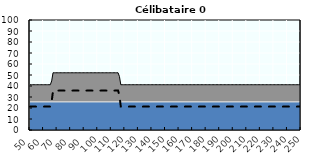
| Category | Coin fiscal marginal (somme des composantes) | Taux d’imposition marginal net |
|---|---|---|
| 50.0 | 41.166 | 21.28 |
| 51.0 | 41.166 | 21.28 |
| 52.0 | 41.166 | 21.28 |
| 53.0 | 41.166 | 21.28 |
| 54.0 | 41.166 | 21.28 |
| 55.0 | 41.166 | 21.28 |
| 56.0 | 41.166 | 21.28 |
| 57.0 | 41.166 | 21.28 |
| 58.0 | 41.166 | 21.28 |
| 59.0 | 41.166 | 21.28 |
| 60.0 | 41.166 | 21.28 |
| 61.0 | 41.166 | 21.28 |
| 62.0 | 41.166 | 21.28 |
| 63.0 | 41.166 | 21.28 |
| 64.0 | 41.166 | 21.28 |
| 65.0 | 41.166 | 21.28 |
| 66.0 | 44.624 | 25.907 |
| 67.0 | 52.028 | 35.813 |
| 68.0 | 52.028 | 35.813 |
| 69.0 | 52.028 | 35.813 |
| 70.0 | 52.028 | 35.813 |
| 71.0 | 52.028 | 35.813 |
| 72.0 | 52.028 | 35.813 |
| 73.0 | 52.028 | 35.813 |
| 74.0 | 52.028 | 35.813 |
| 75.0 | 52.028 | 35.813 |
| 76.0 | 52.028 | 35.813 |
| 77.0 | 52.028 | 35.813 |
| 78.0 | 52.028 | 35.813 |
| 79.0 | 52.028 | 35.813 |
| 80.0 | 52.028 | 35.813 |
| 81.0 | 52.028 | 35.813 |
| 82.0 | 52.028 | 35.813 |
| 83.0 | 52.028 | 35.813 |
| 84.0 | 52.028 | 35.813 |
| 85.0 | 52.028 | 35.813 |
| 86.0 | 52.028 | 35.813 |
| 87.0 | 52.028 | 35.813 |
| 88.0 | 52.028 | 35.813 |
| 89.0 | 52.028 | 35.813 |
| 90.0 | 52.028 | 35.813 |
| 91.0 | 52.028 | 35.813 |
| 92.0 | 52.028 | 35.813 |
| 93.0 | 52.028 | 35.813 |
| 94.0 | 52.028 | 35.813 |
| 95.0 | 52.028 | 35.813 |
| 96.0 | 52.028 | 35.813 |
| 97.0 | 52.028 | 35.813 |
| 98.0 | 52.028 | 35.813 |
| 99.0 | 52.028 | 35.813 |
| 100.0 | 52.028 | 35.813 |
| 101.0 | 52.028 | 35.813 |
| 102.0 | 52.028 | 35.813 |
| 103.0 | 52.028 | 35.813 |
| 104.0 | 52.028 | 35.813 |
| 105.0 | 52.028 | 35.813 |
| 106.0 | 52.028 | 35.813 |
| 107.0 | 52.028 | 35.813 |
| 108.0 | 52.028 | 35.813 |
| 109.0 | 52.028 | 35.813 |
| 110.0 | 52.028 | 35.813 |
| 111.0 | 52.028 | 35.813 |
| 112.0 | 52.028 | 35.813 |
| 113.0 | 52.028 | 35.813 |
| 114.0 | 52.028 | 35.813 |
| 115.0 | 52.028 | 35.813 |
| 116.0 | 48.692 | 31.35 |
| 117.0 | 41.166 | 21.28 |
| 118.0 | 41.166 | 21.28 |
| 119.0 | 41.166 | 21.28 |
| 120.0 | 41.166 | 21.28 |
| 121.0 | 41.166 | 21.28 |
| 122.0 | 41.166 | 21.28 |
| 123.0 | 41.166 | 21.28 |
| 124.0 | 41.166 | 21.28 |
| 125.0 | 41.166 | 21.28 |
| 126.0 | 41.166 | 21.28 |
| 127.0 | 41.166 | 21.28 |
| 128.0 | 41.166 | 21.28 |
| 129.0 | 41.166 | 21.28 |
| 130.0 | 41.166 | 21.28 |
| 131.0 | 41.166 | 21.28 |
| 132.0 | 41.166 | 21.28 |
| 133.0 | 41.166 | 21.28 |
| 134.0 | 41.166 | 21.28 |
| 135.0 | 41.166 | 21.28 |
| 136.0 | 41.166 | 21.28 |
| 137.0 | 41.166 | 21.28 |
| 138.0 | 41.166 | 21.28 |
| 139.0 | 41.166 | 21.28 |
| 140.0 | 41.166 | 21.28 |
| 141.0 | 41.166 | 21.28 |
| 142.0 | 41.166 | 21.28 |
| 143.0 | 41.166 | 21.28 |
| 144.0 | 41.166 | 21.28 |
| 145.0 | 41.166 | 21.28 |
| 146.0 | 41.166 | 21.28 |
| 147.0 | 41.166 | 21.28 |
| 148.0 | 41.166 | 21.28 |
| 149.0 | 41.166 | 21.28 |
| 150.0 | 41.166 | 21.28 |
| 151.0 | 41.166 | 21.28 |
| 152.0 | 41.166 | 21.28 |
| 153.0 | 41.166 | 21.28 |
| 154.0 | 41.166 | 21.28 |
| 155.0 | 41.166 | 21.28 |
| 156.0 | 41.166 | 21.28 |
| 157.0 | 41.166 | 21.28 |
| 158.0 | 41.166 | 21.28 |
| 159.0 | 41.166 | 21.28 |
| 160.0 | 41.166 | 21.28 |
| 161.0 | 41.166 | 21.28 |
| 162.0 | 41.166 | 21.28 |
| 163.0 | 41.166 | 21.28 |
| 164.0 | 41.166 | 21.28 |
| 165.0 | 41.166 | 21.28 |
| 166.0 | 41.166 | 21.28 |
| 167.0 | 41.166 | 21.28 |
| 168.0 | 41.166 | 21.28 |
| 169.0 | 41.166 | 21.28 |
| 170.0 | 41.166 | 21.28 |
| 171.0 | 41.166 | 21.28 |
| 172.0 | 41.166 | 21.28 |
| 173.0 | 41.166 | 21.28 |
| 174.0 | 41.166 | 21.28 |
| 175.0 | 41.166 | 21.28 |
| 176.0 | 41.166 | 21.28 |
| 177.0 | 41.166 | 21.28 |
| 178.0 | 41.166 | 21.28 |
| 179.0 | 41.166 | 21.28 |
| 180.0 | 41.166 | 21.28 |
| 181.0 | 41.166 | 21.28 |
| 182.0 | 41.166 | 21.28 |
| 183.0 | 41.166 | 21.28 |
| 184.0 | 41.166 | 21.28 |
| 185.0 | 41.166 | 21.28 |
| 186.0 | 41.166 | 21.28 |
| 187.0 | 41.166 | 21.28 |
| 188.0 | 41.166 | 21.28 |
| 189.0 | 41.166 | 21.28 |
| 190.0 | 41.166 | 21.28 |
| 191.0 | 41.166 | 21.28 |
| 192.0 | 41.166 | 21.28 |
| 193.0 | 41.166 | 21.28 |
| 194.0 | 41.166 | 21.28 |
| 195.0 | 41.166 | 21.28 |
| 196.0 | 41.166 | 21.28 |
| 197.0 | 41.166 | 21.28 |
| 198.0 | 41.166 | 21.28 |
| 199.0 | 41.166 | 21.28 |
| 200.0 | 41.166 | 21.28 |
| 201.0 | 41.166 | 21.28 |
| 202.0 | 41.166 | 21.28 |
| 203.0 | 41.166 | 21.28 |
| 204.0 | 41.166 | 21.28 |
| 205.0 | 41.166 | 21.28 |
| 206.0 | 41.166 | 21.28 |
| 207.0 | 41.166 | 21.28 |
| 208.0 | 41.166 | 21.28 |
| 209.0 | 41.166 | 21.28 |
| 210.0 | 41.166 | 21.28 |
| 211.0 | 41.166 | 21.28 |
| 212.0 | 41.166 | 21.28 |
| 213.0 | 41.166 | 21.28 |
| 214.0 | 41.166 | 21.28 |
| 215.0 | 41.166 | 21.28 |
| 216.0 | 41.166 | 21.28 |
| 217.0 | 41.166 | 21.28 |
| 218.0 | 41.166 | 21.28 |
| 219.0 | 41.166 | 21.28 |
| 220.0 | 41.166 | 21.28 |
| 221.0 | 41.166 | 21.28 |
| 222.0 | 41.166 | 21.28 |
| 223.0 | 41.166 | 21.28 |
| 224.0 | 41.166 | 21.28 |
| 225.0 | 41.166 | 21.28 |
| 226.0 | 41.166 | 21.28 |
| 227.0 | 41.166 | 21.28 |
| 228.0 | 41.166 | 21.28 |
| 229.0 | 41.166 | 21.28 |
| 230.0 | 41.166 | 21.28 |
| 231.0 | 41.166 | 21.28 |
| 232.0 | 41.166 | 21.28 |
| 233.0 | 41.166 | 21.28 |
| 234.0 | 41.166 | 21.28 |
| 235.0 | 41.166 | 21.28 |
| 236.0 | 41.166 | 21.28 |
| 237.0 | 41.166 | 21.28 |
| 238.0 | 41.166 | 21.28 |
| 239.0 | 41.166 | 21.28 |
| 240.0 | 41.166 | 21.28 |
| 241.0 | 41.166 | 21.28 |
| 242.0 | 41.166 | 21.28 |
| 243.0 | 41.166 | 21.28 |
| 244.0 | 41.166 | 21.28 |
| 245.0 | 41.166 | 21.28 |
| 246.0 | 41.166 | 21.28 |
| 247.0 | 41.166 | 21.28 |
| 248.0 | 41.166 | 21.28 |
| 249.0 | 41.166 | 21.28 |
| 250.0 | 41.166 | 21.28 |